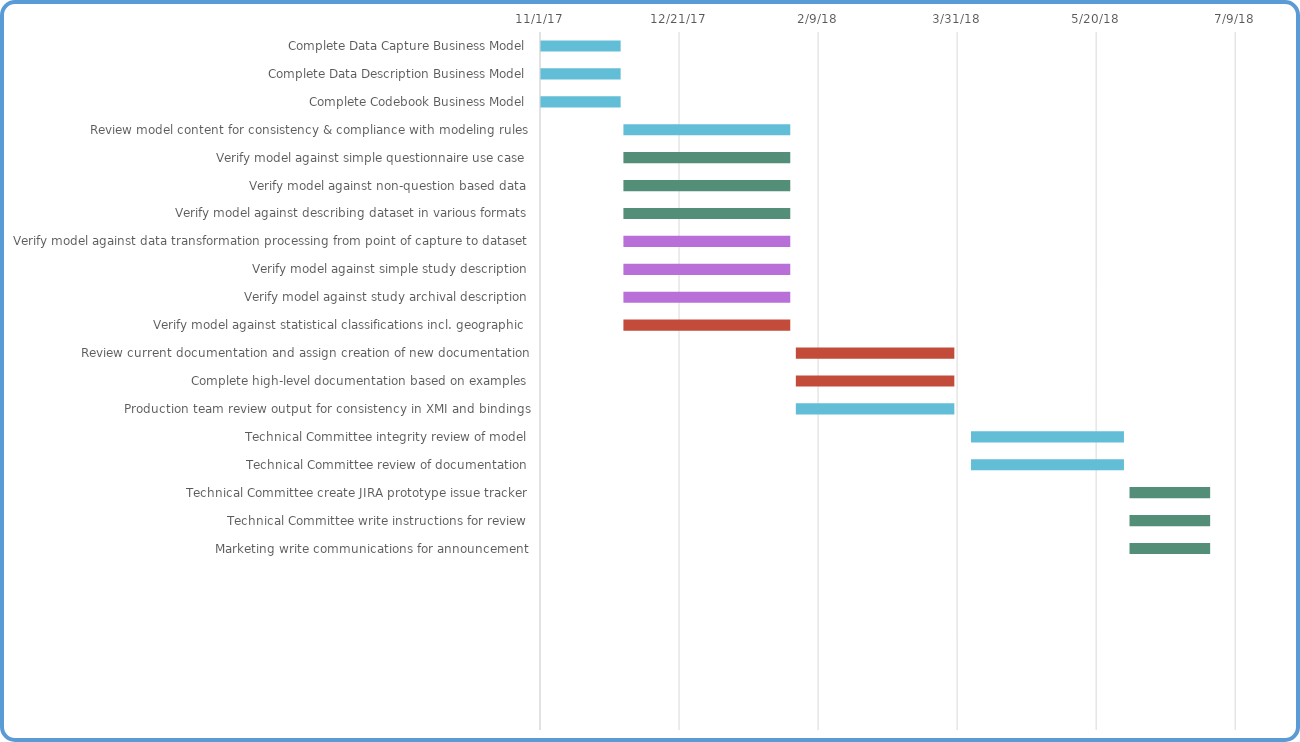
| Category | Start Date | Duration |
|---|---|---|
| Complete Data Capture Business Model | 11/1/17 | 29 |
| Complete Data Description Business Model | 11/1/17 | 29 |
| Complete Codebook Business Model | 11/1/17 | 29 |
| Review model content for consistency & compliance with modeling rules | 12/1/17 | 60 |
| Verify model against simple questionnaire use case | 12/1/17 | 60 |
| Verify model against non-question based data | 12/1/17 | 60 |
| Verify model against describing dataset in various formats | 12/1/17 | 60 |
| Verify model against data transformation processing from point of capture to dataset | 12/1/17 | 60 |
| Verify model against simple study description | 12/1/17 | 60 |
| Verify model against study archival description | 12/1/17 | 60 |
| Verify model against statistical classifications incl. geographic | 12/1/17 | 60 |
| Review current documentation and assign creation of new documentation | 2/1/18 | 57 |
| Complete high-level documentation based on examples | 2/1/18 | 57 |
| Production team review output for consistency in XMI and bindings | 2/1/18 | 57 |
| Technical Committee integrity review of model | 4/5/18 | 55 |
| Technical Committee review of documentation | 4/5/18 | 55 |
| Technical Committee create JIRA prototype issue tracker | 6/1/18 | 29 |
| Technical Committee write instructions for review | 6/1/18 | 29 |
| Marketing write communications for announcement | 6/1/18 | 29 |